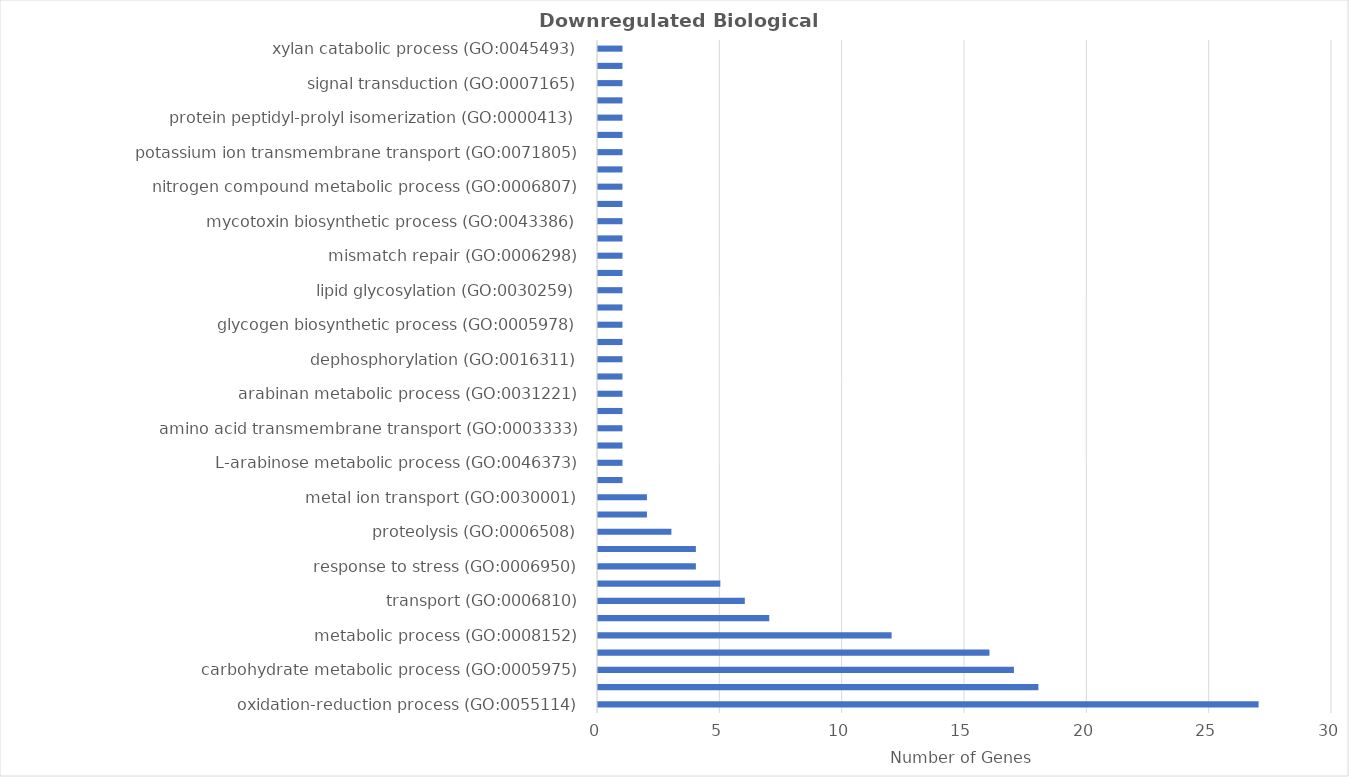
| Category | Genes |
|---|---|
| oxidation-reduction process (GO:0055114) | 27 |
| transmembrane transport (GO:0055085) | 18 |
| carbohydrate metabolic process (GO:0005975) | 17 |
| regulation of transcription, DNA-templated (GO:0006355) | 16 |
| metabolic process (GO:0008152) | 12 |
| lipid metabolic process (GO:0006629) | 7 |
| transport (GO:0006810) | 6 |
| protein phosphorylation (GO:0006468) | 5 |
| response to stress (GO:0006950) | 4 |
| transcription, DNA-templated (GO:0006351) | 4 |
| proteolysis (GO:0006508) | 3 |
| glycolytic process (GO:0006096) | 2 |
| metal ion transport (GO:0030001) | 2 |
| G-protein coupled receptor signaling pathway (GO:0007186) | 1 |
| L-arabinose metabolic process (GO:0046373) | 1 |
| RNA polyadenylation (GO:0043631) | 1 |
| amino acid transmembrane transport (GO:0003333) | 1 |
| ammonium transport (GO:0015696) | 1 |
| arabinan metabolic process (GO:0031221) | 1 |
| biosynthetic process (GO:0009058) | 1 |
| dephosphorylation (GO:0016311) | 1 |
| glycerol metabolic process (GO:0006071) | 1 |
| glycogen biosynthetic process (GO:0005978) | 1 |
| intracellular signal transduction (GO:0035556) | 1 |
| lipid glycosylation (GO:0030259) | 1 |
| mannose metabolic process (GO:0006013) | 1 |
| mismatch repair (GO:0006298) | 1 |
| mitochondrial respiratory chain complex III assembly (GO:0034551) | 1 |
| mycotoxin biosynthetic process (GO:0043386) | 1 |
| nickel cation transmembrane transport (GO:0035444) | 1 |
| nitrogen compound metabolic process (GO:0006807) | 1 |
| nucleobase-containing compound metabolic process (GO:0006139) | 1 |
| potassium ion transmembrane transport (GO:0071805) | 1 |
| protein deubiquitination (GO:0016579) | 1 |
| protein peptidyl-prolyl isomerization (GO:0000413) | 1 |
| response to oxidative stress (GO:0006979) | 1 |
| signal transduction (GO:0007165) | 1 |
| tRNA splicing, via endonucleolytic cleavage and ligation (GO:0006388) | 1 |
| xylan catabolic process (GO:0045493) | 1 |